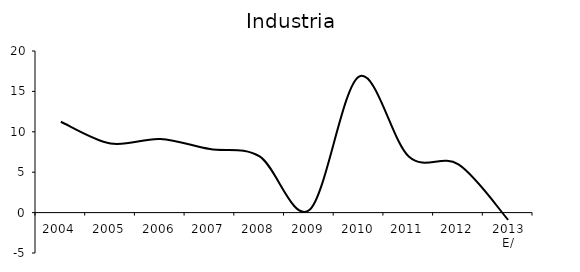
| Category | Industria |
|---|---|
| 2004 | 11.241 |
| 2005 | 8.544 |
| 2006 | 9.104 |
| 2007 | 7.867 |
| 2008 | 6.952 |
| 2009 | 0.315 |
| 2010 | 16.834 |
| 2011 | 6.948 |
| 2012 | 5.959 |
| 2013 E/ | -0.899 |